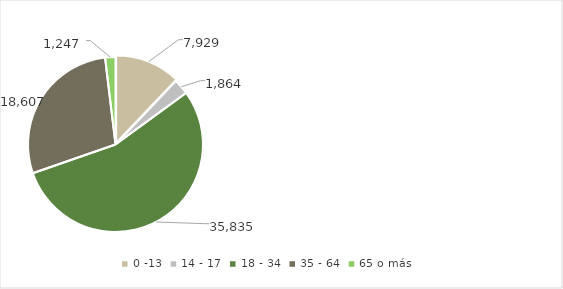
| Category | Series 0 |
|---|---|
| 0 -13 | 7929 |
| 14 - 17 | 1864 |
| 18 - 34 | 35835 |
| 35 - 64 | 18607 |
| 65 o más | 1247 |